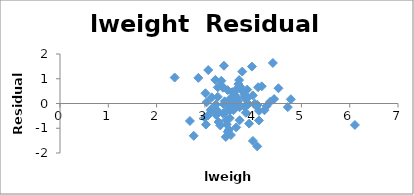
| Category | Series 0 |
|---|---|
| 2.769459 | -1.305 |
| 3.319626 | -0.887 |
| 2.691243 | -0.706 |
| 3.282789 | -0.747 |
| 3.432373 | -1.35 |
| 3.228826 | -0.042 |
| 3.473518 | -1.141 |
| 3.539509 | -1.273 |
| 3.539509 | -0.12 |
| 3.244544 | -0.259 |
| 3.604138 | -0.182 |
| 3.598681 | 0.437 |
| 3.022861 | -0.853 |
| 2.998229 | -0.572 |
| 3.442019 | -0.659 |
| 3.061052 | -0.491 |
| 3.516013 | 0.173 |
| 3.649359 | -0.966 |
| 3.267666 | 0.27 |
| 3.825375 | -0.135 |
| 3.419365 | -0.368 |
| 3.501043 | -1.055 |
| 3.37588 | 0.639 |
| 3.451574 | -0.843 |
| 3.6674 | -0.064 |
| 3.124565 | -0.286 |
| 3.719651 | -0.153 |
| 3.865979 | 0.194 |
| 3.128951 | -0.235 |
| 3.37588 | -0.399 |
| 4.090169 | -0.06 |
| 6.10758 | -0.867 |
| 3.037354 | 0.051 |
| 3.267666 | 0.653 |
| 3.216874 | 0.953 |
| 4.11985 | -0.685 |
| 3.657131 | 0.232 |
| 2.374906 | 1.05 |
| 4.085136 | -1.733 |
| 3.013081 | 0.414 |
| 3.141995 | 0.248 |
| 3.68261 | 0.094 |
| 3.865979 | 0.277 |
| 3.896909 | -0.017 |
| 3.409496 | 0.087 |
| 3.392829 | -0.033 |
| 3.995445 | -1.512 |
| 4.035125 | -0.008 |
| 3.498022 | -0.117 |
| 3.568123 | 0.456 |
| 3.993603 | 0.327 |
| 4.234831 | -0.273 |
| 3.633631 | 0.532 |
| 4.121473 | -0.298 |
| 3.516013 | -0.592 |
| 4.280132 | -0.101 |
| 2.865054 | 1.035 |
| 3.764682 | 0.535 |
| 4.178226 | 0.695 |
| 3.851211 | 0.186 |
| 4.524502 | 0.615 |
| 3.719651 | -0.677 |
| 3.524889 | -0.157 |
| 3.917011 | -0.812 |
| 3.623007 | 0.337 |
| 3.836221 | 0.223 |
| 3.878466 | -0.048 |
| 4.050915 | -0.078 |
| 4.408547 | 1.638 |
| 4.780383 | 0.172 |
| 3.593194 | -0.271 |
| 3.341093 | 0.918 |
| 3.825375 | 0.29 |
| 3.236716 | -0.469 |
| 3.849083 | -0.372 |
| 3.263849 | -0.371 |
| 4.433789 | 0.18 |
| 4.354784 | 0.073 |
| 3.582129 | -0.017 |
| 3.823192 | 0.357 |
| 3.070376 | 1.352 |
| 3.473518 | 0.538 |
| 3.888754 | 0.004 |
| 3.838376 | 0.204 |
| 3.709907 | 0.946 |
| 3.51898 | -0.279 |
| 3.731699 | 0.673 |
| 3.369018 | 0.675 |
| 4.718052 | -0.146 |
| 3.69511 | 0.784 |
| 4.101817 | 0.657 |
| 3.677566 | 0.059 |
| 3.876396 | 0.562 |
| 3.896909 | -0.021 |
| 3.396185 | 1.526 |
| 3.77391 | 1.29 |
| 3.974998 | 1.491 |